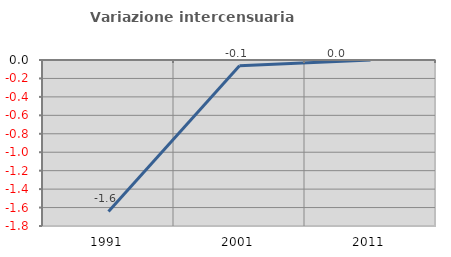
| Category | Variazione intercensuaria annua |
|---|---|
| 1991.0 | -1.643 |
| 2001.0 | -0.062 |
| 2011.0 | 0 |